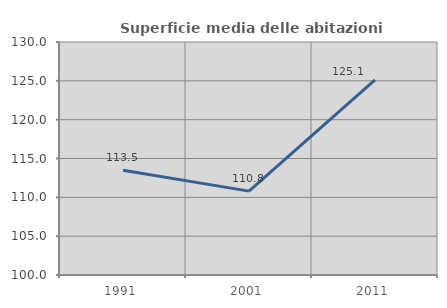
| Category | Superficie media delle abitazioni occupate |
|---|---|
| 1991.0 | 113.498 |
| 2001.0 | 110.798 |
| 2011.0 | 125.131 |